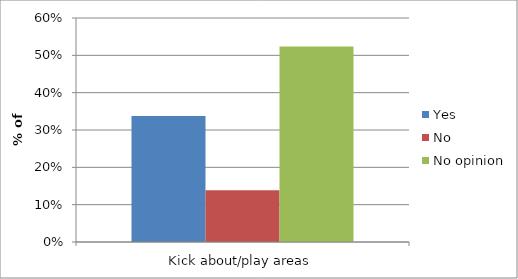
| Category | Yes | No | No opinion |
|---|---|---|---|
| Kick about/play areas | 0.338 | 0.139 | 0.524 |